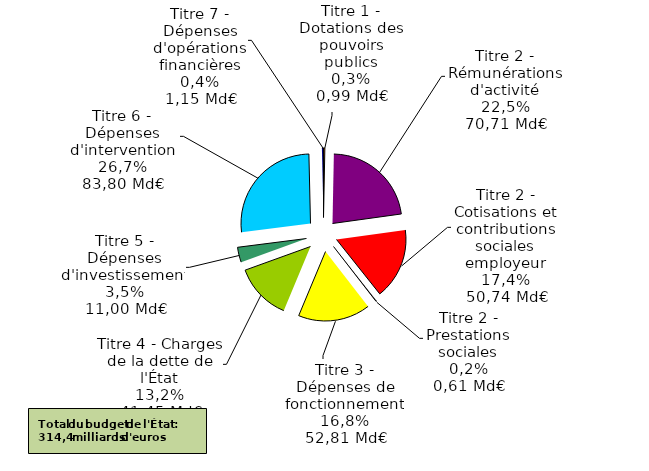
| Category | Part dans le budget de l'État en 2016 (en %) |
|---|---|
| Titre 1 - Dotations des pouvoirs publics | 0.003 |
| Titre 2 - Rémunérations d'activité | 0.225 |
| Titre 2 - Cotisations et contributions sociales employeur | 0.165 |
| Titre 2 - Prestations sociales | 0.002 |
| Titre 3 - Dépenses de fonctionnement | 0.168 |
| Titre 4 - Charges de la dette de l'État | 0.132 |
| Titre 5 - Dépenses d'investissement | 0.035 |
| Titre 6 - Dépenses d'intervention | 0.267 |
| Titre 7 - Dépenses d'opérations financières | 0.004 |